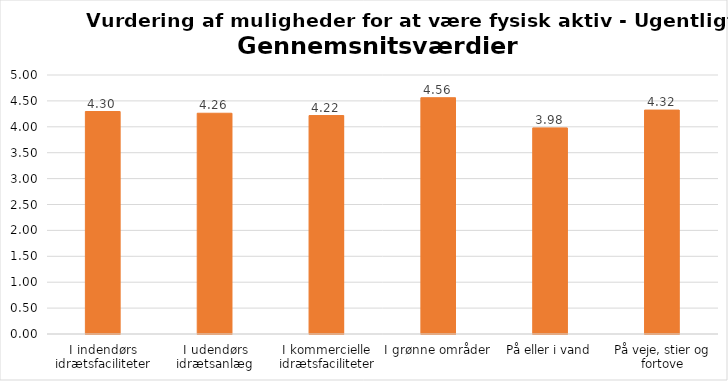
| Category | Gennemsnit |
|---|---|
| I indendørs idrætsfaciliteter | 4.295 |
| I udendørs idrætsanlæg | 4.262 |
| I kommercielle idrætsfaciliteter | 4.217 |
| I grønne områder | 4.561 |
| På eller i vand | 3.979 |
| På veje, stier og fortove | 4.323 |